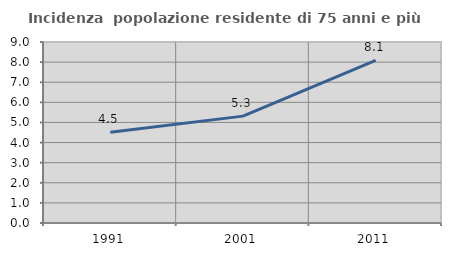
| Category | Incidenza  popolazione residente di 75 anni e più |
|---|---|
| 1991.0 | 4.513 |
| 2001.0 | 5.314 |
| 2011.0 | 8.084 |